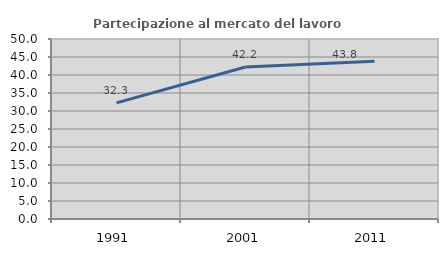
| Category | Partecipazione al mercato del lavoro  femminile |
|---|---|
| 1991.0 | 32.272 |
| 2001.0 | 42.222 |
| 2011.0 | 43.81 |